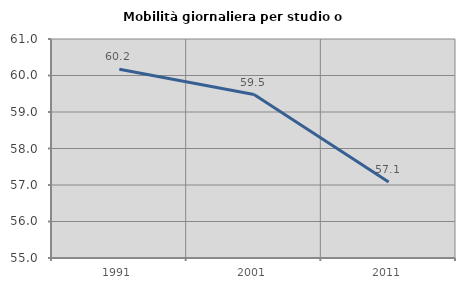
| Category | Mobilità giornaliera per studio o lavoro |
|---|---|
| 1991.0 | 60.171 |
| 2001.0 | 59.479 |
| 2011.0 | 57.083 |